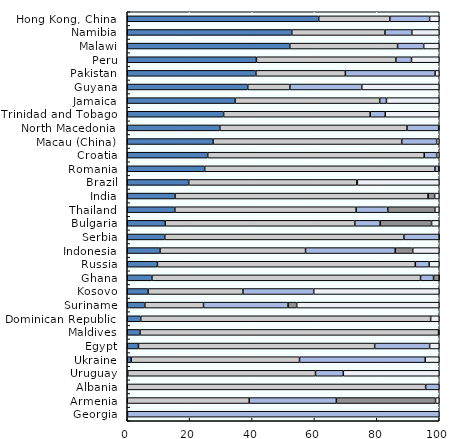
| Category | Equity | Bills and bonds | Cash and deposits | CIS (when look-through unavailable) | Other |
|---|---|---|---|---|---|
| Hong Kong, China | 61.367 | 22.795 | 12.756 | 0 | 3.081 |
| Namibia | 52.722 | 29.853 | 8.631 | 0 | 8.794 |
| Malawi | 52.099 | 34.546 | 8.364 | 0 | 4.991 |
| Peru | 41.393 | 44.702 | 5.008 | 0 | 8.897 |
| Pakistan | 41.226 | 28.68 | 28.759 | 0 | 1.335 |
| Guyana | 38.619 | 13.501 | 23.048 | 0 | 24.832 |
| Jamaica | 34.553 | 46.369 | 2.151 | 0 | 16.927 |
| Trinidad and Tobago | 30.884 | 46.978 | 4.838 | 0 | 17.299 |
| North Macedonia | 29.678 | 59.983 | 10.142 | 0 | 0.198 |
| Macau (China) | 27.506 | 60.469 | 11.194 | 0 | 0.83 |
| Croatia | 25.783 | 69.398 | 4.006 | 0 | 0.812 |
| Romania | 24.816 | 73.796 | 1.227 | 0 | 0.161 |
| Brazil | 19.693 | 53.862 | 0.2 | 0 | 26.245 |
| India | 15.315 | 81.105 | 0.015 | 2.095 | 1.47 |
| Thailand | 15.264 | 58.092 | 10.145 | 15.103 | 1.396 |
| Bulgaria | 12.15 | 60.78 | 8.123 | 16.488 | 2.459 |
| Serbia | 12.03 | 76.641 | 11.3 | 0 | 0.029 |
| Indonesia | 10.509 | 46.634 | 28.748 | 5.614 | 8.496 |
| Russia | 9.687 | 82.64 | 4.426 | 0 | 3.247 |
| Ghana | 7.911 | 86.097 | 4.162 | 1.83 | 0 |
| Kosovo | 6.683 | 30.393 | 22.688 | 0 | 40.236 |
| Suriname | 5.643 | 18.803 | 27.098 | 2.761 | 45.695 |
| Dominican Republic | 4.323 | 92.922 | 0.002 | 0 | 2.753 |
| Maldives | 4.083 | 95.69 | 0.226 | 0 | 0 |
| Egypt | 3.587 | 75.711 | 17.626 | 0 | 3.076 |
| Ukraine | 1.278 | 53.936 | 40.294 | 0 | 4.492 |
| Uruguay | 0.15 | 60.19 | 8.91 | 0 | 30.75 |
| Albania | 0 | 95.648 | 4.352 | 0 | 0 |
| Armenia | 0 | 39.106 | 27.917 | 31.787 | 1.191 |
| Georgia | 0 | 0.063 | 99.937 | 0 | 0 |